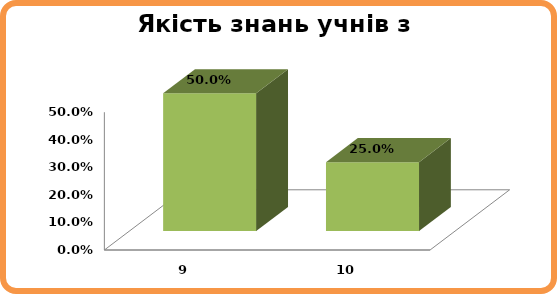
| Category | Series 0 |
|---|---|
| 9.0 | 0.5 |
| 10.0 | 0.25 |